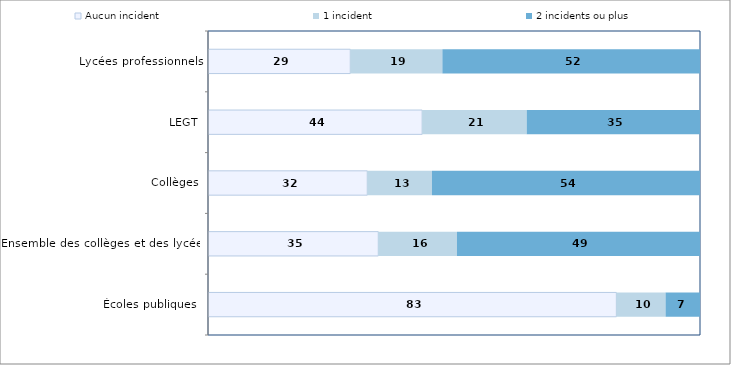
| Category | Aucun incident | 1 incident | 2 incidents ou plus  |
|---|---|---|---|
| Écoles publiques  | 83 | 10 | 7 |
| Ensemble des collèges et des lycées | 34.607 | 16 | 49.393 |
| Collèges | 32.37 | 13.156 | 54.475 |
| LEGT | 43.523 | 21.258 | 35.219 |
| Lycées professionnels | 28.913 | 18.725 | 52.362 |